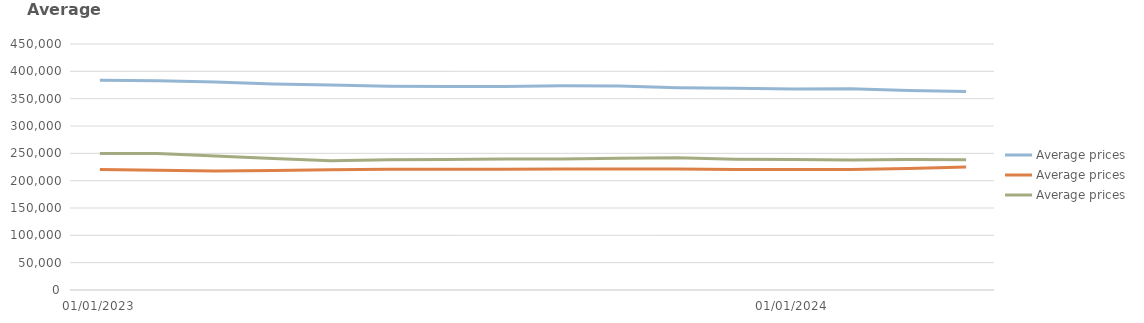
| Category | England | Scotland | Wales |
|---|---|---|---|
| 01/01/2023 | 383554.352 | 220236.278 | 249766.427 |
| 01/02/2023 | 382893.523 | 218902.318 | 249656.596 |
| 01/03/2023 | 380472.97 | 217805.002 | 245191.91 |
| 01/04/2023 | 376965.607 | 218620.533 | 240343.602 |
| 01/05/2023 | 375146.185 | 220144.785 | 236510.099 |
| 01/06/2023 | 372762.651 | 220984.776 | 238336.523 |
| 01/07/2023 | 372048.721 | 220839.471 | 238828.146 |
| 01/08/2023 | 372325.309 | 220981.936 | 239669.386 |
| 01/09/2023 | 373440.691 | 221559.139 | 239813.536 |
| 01/10/2023 | 373341.665 | 221477.53 | 241000.721 |
| 01/11/2023 | 370096.768 | 221335.828 | 241750.898 |
| 01/12/2023 | 369127.61 | 220461.666 | 239377.114 |
| 01/01/2024 | 367738.055 | 220329.718 | 238561.839 |
| 01/02/2024 | 367942.495 | 220280.326 | 237773.423 |
| 01/03/2024 | 364738.557 | 222427.419 | 238665.431 |
| 01/04/2024 | 363036.934 | 224977.089 | 238188.77 |